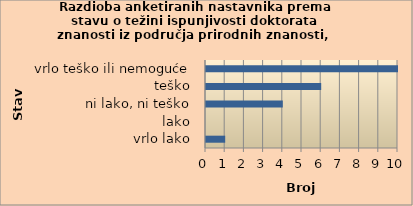
| Category | Series 4 |
|---|---|
| vrlo lako | 1 |
| lako | 0 |
| ni lako, ni teško | 4 |
| teško | 6 |
| vrlo teško ili nemoguće | 10 |